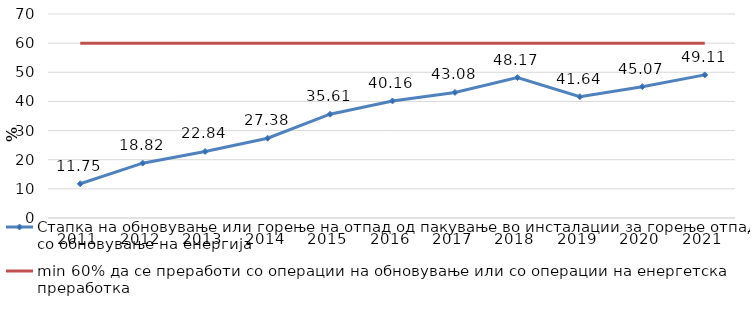
| Category | Стапка на обновување или горење на отпад од пакување во инсталации за горење отпад со обновување на енергија | min 60% да се преработи со операции на обновување или со операции на енергетска преработка |
|---|---|---|
| 2011.0 | 11.75 | 60 |
| 2012.0 | 18.82 | 60 |
| 2013.0 | 22.84 | 60 |
| 2014.0 | 27.38 | 60 |
| 2015.0 | 35.61 | 60 |
| 2016.0 | 40.16 | 60 |
| 2017.0 | 43.08 | 60 |
| 2018.0 | 48.17 | 60 |
| 2019.0 | 41.64 | 60 |
| 2020.0 | 45.07 | 60 |
| 2021.0 | 49.11 | 60 |